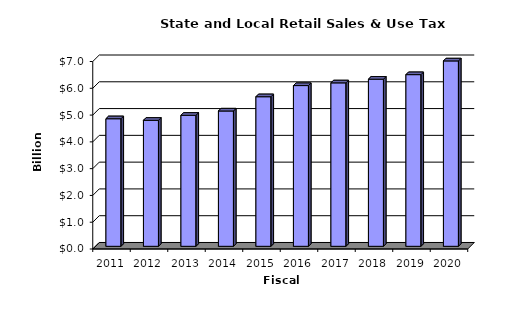
| Category | Series 0 |
|---|---|
| 2011.0 | 4.762 |
| 2012.0 | 4.704 |
| 2013.0 | 4.891 |
| 2014.0 | 5.052 |
| 2015.0 | 5.585 |
| 2016.0 | 6.001 |
| 2017.0 | 6.102 |
| 2018.0 | 6.24 |
| 2019.0 | 6.409 |
| 2020.0 | 6.922 |